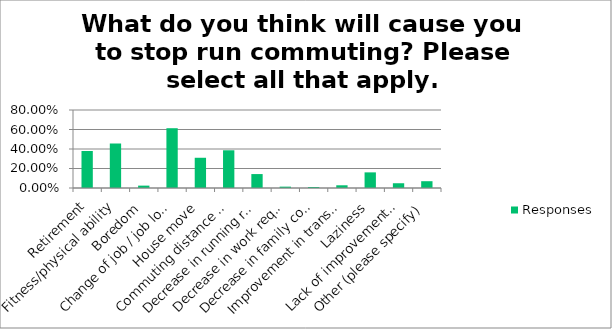
| Category | Responses |
|---|---|
| Retirement | 0.38 |
| Fitness/physical ability | 0.456 |
| Boredom | 0.024 |
| Change of job / job location | 0.613 |
| House move | 0.31 |
| Commuting distance becoming too great | 0.387 |
| Decrease in running requirements | 0.143 |
| Decrease in work requirements | 0.014 |
| Decrease in family commitments | 0.01 |
| Improvement in transport alternatives | 0.028 |
| Laziness | 0.16 |
| Lack of improvement in run commuting facilities | 0.049 |
| Other (please specify) | 0.07 |